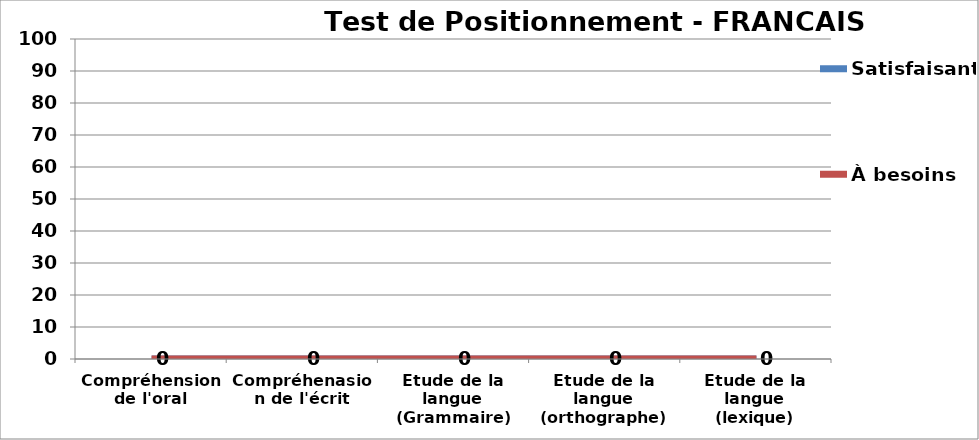
| Category | Satisfaisant | À besoins |
|---|---|---|
| Compréhension de l'oral
 | 0 | 0 |
| Compréhenasion de l'écrit | 0 | 0 |
| Etude de la langue (Grammaire) | 0 | 0 |
| Etude de la langue (orthographe) | 0 | 0 |
| Etude de la langue (lexique) | 0 | 0 |